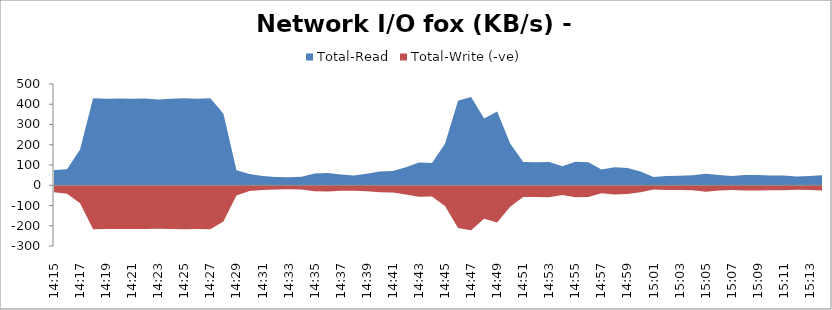
| Category | Total-Read | Total-Write (-ve) |
|---|---|---|
| 14:15 | 75.6 | -34.2 |
| 14:16 | 79.3 | -42.1 |
| 14:17 | 177.1 | -88.9 |
| 14:18 | 429.5 | -217.7 |
| 14:19 | 427.4 | -216.1 |
| 14:20 | 427.9 | -216.3 |
| 14:21 | 427.7 | -216.3 |
| 14:22 | 427.8 | -216.5 |
| 14:23 | 423.6 | -214.6 |
| 14:24 | 427.7 | -216.2 |
| 14:25 | 429.2 | -217.3 |
| 14:26 | 427.3 | -216 |
| 14:27 | 429.1 | -216.9 |
| 14:28 | 352.7 | -179.5 |
| 14:29 | 73.9 | -50.2 |
| 14:30 | 55.1 | -28.3 |
| 14:31 | 45.5 | -23.9 |
| 14:32 | 40.2 | -20.7 |
| 14:33 | 39.5 | -20.3 |
| 14:34 | 41.7 | -21.3 |
| 14:35 | 57.6 | -29.6 |
| 14:36 | 60.4 | -30.6 |
| 14:37 | 53.1 | -27.6 |
| 14:38 | 48.1 | -27.2 |
| 14:39 | 56.4 | -29.5 |
| 14:40 | 67.4 | -34.5 |
| 14:41 | 70.4 | -35.9 |
| 14:42 | 89.3 | -45.2 |
| 14:43 | 112.1 | -57.4 |
| 14:44 | 109.9 | -55.6 |
| 14:45 | 205 | -102.9 |
| 14:46 | 417.5 | -211.1 |
| 14:47 | 436.4 | -222 |
| 14:48 | 329.1 | -165.1 |
| 14:49 | 363.6 | -183.7 |
| 14:50 | 206.4 | -105.8 |
| 14:51 | 114.7 | -58.6 |
| 14:52 | 114 | -57.9 |
| 14:53 | 115.4 | -58.7 |
| 14:54 | 94.3 | -48 |
| 14:55 | 116.6 | -59.2 |
| 14:56 | 113.3 | -57.6 |
| 14:57 | 77.8 | -39.7 |
| 14:58 | 88.8 | -45.2 |
| 14:59 | 85.2 | -43.7 |
| 15:00 | 68.3 | -35 |
| 15:01 | 41 | -21.1 |
| 15:02 | 45.4 | -23.3 |
| 15:03 | 46.8 | -23.5 |
| 15:04 | 48.8 | -25.1 |
| 15:05 | 57.2 | -31.5 |
| 15:06 | 50.5 | -25.7 |
| 15:07 | 45.7 | -23.5 |
| 15:08 | 50.1 | -26 |
| 15:09 | 50.2 | -25.8 |
| 15:10 | 48.6 | -24.8 |
| 15:11 | 48 | -24.6 |
| 15:12 | 43.1 | -22.2 |
| 15:13 | 45.7 | -23.3 |
| 15:14 | 50.1 | -25.7 |